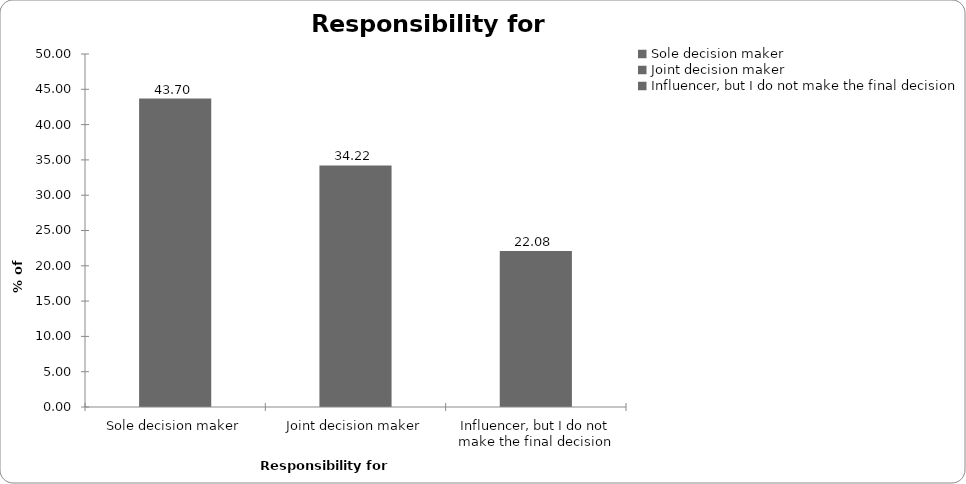
| Category | Responsibility for insurance |
|---|---|
| Sole decision maker | 43.696 |
| Joint decision maker | 34.223 |
| Influencer, but I do not make the final decision | 22.081 |